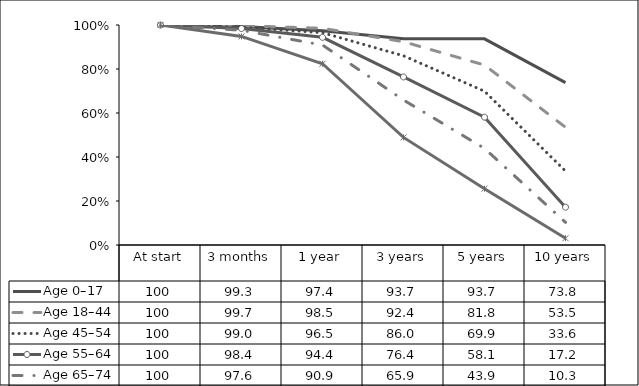
| Category | Age 0–17 | Age 18–44  | Age 45–54  | Age 55–64  | Age 65–74  | Age 75+  |
|---|---|---|---|---|---|---|
| At start | 100 | 100 | 100 | 100 | 100 | 100 |
| 3 months | 99.3 | 99.7 | 99 | 98.4 | 97.6 | 94.8 |
| 1 year | 97.4 | 98.5 | 96.5 | 94.4 | 90.9 | 82.4 |
| 3 years | 93.7 | 92.4 | 86 | 76.4 | 65.9 | 48.9 |
| 5 years | 93.7 | 81.8 | 69.9 | 58.1 | 43.9 | 25.6 |
| 10 years | 73.8 | 53.5 | 33.6 | 17.2 | 10.3 | 3.1 |